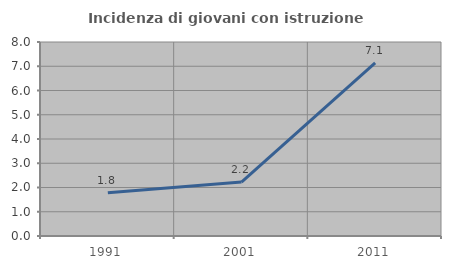
| Category | Incidenza di giovani con istruzione universitaria |
|---|---|
| 1991.0 | 1.786 |
| 2001.0 | 2.222 |
| 2011.0 | 7.143 |